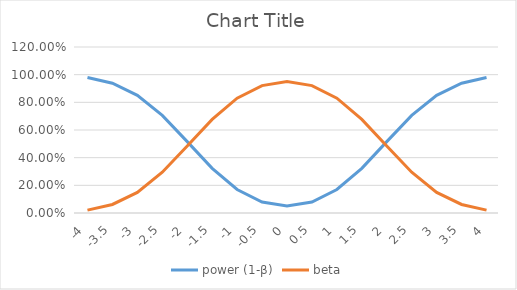
| Category | power (1-β) | beta |
|---|---|---|
| -4.0 | 0.979 | 0.021 |
| -3.5 | 0.938 | 0.062 |
| -3.0 | 0.851 | 0.149 |
| -2.5 | 0.705 | 0.295 |
| -2.0 | 0.516 | 0.484 |
| -1.5 | 0.323 | 0.677 |
| -1.0 | 0.17 | 0.83 |
| -0.5 | 0.079 | 0.921 |
| 0.0 | 0.05 | 0.95 |
| 0.5 | 0.079 | 0.921 |
| 1.0 | 0.17 | 0.83 |
| 1.5 | 0.323 | 0.677 |
| 2.0 | 0.516 | 0.484 |
| 2.5 | 0.705 | 0.295 |
| 3.0 | 0.851 | 0.149 |
| 3.5 | 0.938 | 0.062 |
| 4.0 | 0.979 | 0.021 |